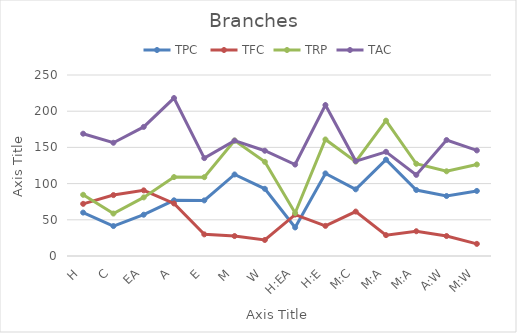
| Category | TPC  | TFC | TRP | TAC |
|---|---|---|---|---|
| H | 59.954 | 72.033 | 84.539 | 168.916 |
| C | 41.375 | 84.128 | 58.619 | 156.408 |
| EA | 57.047 | 90.669 | 80.935 | 178.302 |
| A | 76.9 | 72.576 | 108.996 | 218.155 |
| E | 76.791 | 29.886 | 108.87 | 135.221 |
| M | 112.605 | 27.565 | 159.543 | 159.375 |
| W | 92.798 | 22.145 | 130.052 | 145.389 |
| H:EA | 39.453 | 57.198 | 59.375 | 126.315 |
| H:E | 114.062 | 41.63 | 160.966 | 208.436 |
| M:C | 92.093 | 61.366 | 130.395 | 131.103 |
| M:A | 133.064 | 28.824 | 186.912 | 143.939 |
| M:A | 91.148 | 34.193 | 127.395 | 112.027 |
| A:W | 82.861 | 27.583 | 116.989 | 160.156 |
| M:W | 89.869 | 16.762 | 126.434 | 145.833 |